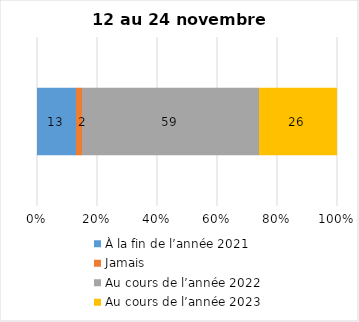
| Category | À la fin de l’année 2021 | Jamais | Au cours de l’année 2022 | Au cours de l’année 2023 |
|---|---|---|---|---|
| 0 | 13 | 2 | 59 | 26 |